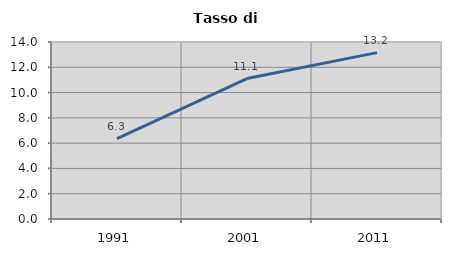
| Category | Tasso di disoccupazione   |
|---|---|
| 1991.0 | 6.349 |
| 2001.0 | 11.111 |
| 2011.0 | 13.158 |